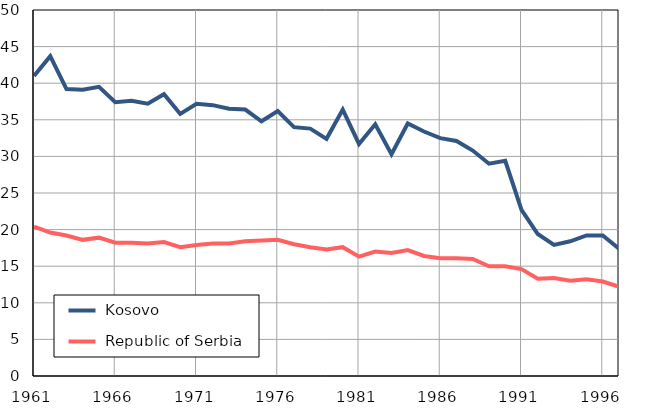
| Category |  Kosovo |  Republic of Serbia |
|---|---|---|
| 1961.0 | 41 | 20.4 |
| 1962.0 | 43.7 | 19.6 |
| 1963.0 | 39.2 | 19.2 |
| 1964.0 | 39.1 | 18.6 |
| 1965.0 | 39.5 | 18.9 |
| 1966.0 | 37.4 | 18.2 |
| 1967.0 | 37.6 | 18.2 |
| 1968.0 | 37.2 | 18.1 |
| 1969.0 | 38.5 | 18.3 |
| 1970.0 | 35.8 | 17.6 |
| 1971.0 | 37.2 | 17.9 |
| 1972.0 | 37 | 18.1 |
| 1973.0 | 36.5 | 18.1 |
| 1974.0 | 36.4 | 18.4 |
| 1975.0 | 34.8 | 18.5 |
| 1976.0 | 36.2 | 18.6 |
| 1977.0 | 34 | 18 |
| 1978.0 | 33.8 | 17.6 |
| 1979.0 | 32.4 | 17.3 |
| 1980.0 | 36.4 | 17.6 |
| 1981.0 | 31.7 | 16.3 |
| 1982.0 | 34.4 | 17 |
| 1983.0 | 30.3 | 16.8 |
| 1984.0 | 34.5 | 17.2 |
| 1985.0 | 33.4 | 16.4 |
| 1986.0 | 32.5 | 16.1 |
| 1987.0 | 32.1 | 16.1 |
| 1988.0 | 30.8 | 16 |
| 1989.0 | 29 | 15 |
| 1990.0 | 29.4 | 15 |
| 1991.0 | 22.7 | 14.6 |
| 1992.0 | 19.4 | 13.3 |
| 1993.0 | 17.9 | 13.4 |
| 1994.0 | 18.4 | 13 |
| 1995.0 | 19.2 | 13.2 |
| 1996.0 | 19.2 | 12.9 |
| 1997.0 | 17.4 | 12.2 |